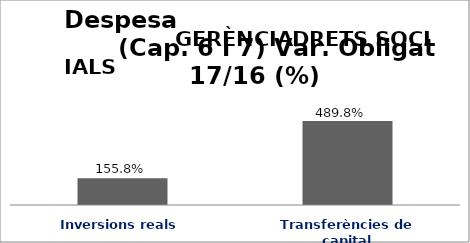
| Category | Series 0 |
|---|---|
| Inversions reals | 1.558 |
| Transferències de capital | 4.898 |